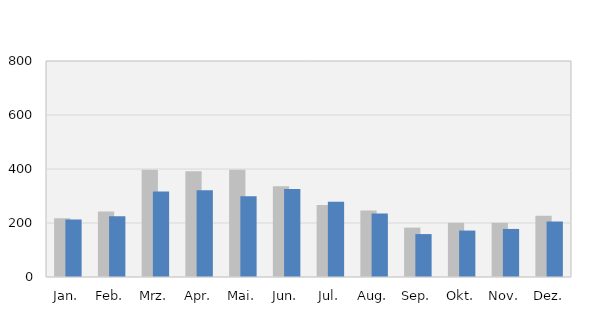
| Category | 2017 | 2018 |
|---|---|---|
| Jan. | 218 | 213 |
| Feb. | 243 | 225 |
| Mrz. | 397 | 317 |
| Apr. | 392 | 321 |
| Mai. | 397 | 299 |
| Jun. | 336 | 326 |
| Jul. | 267 | 279 |
| Aug. | 246 | 235 |
| Sep. | 183 | 159 |
| Okt. | 201 | 172 |
| Nov. | 201 | 178 |
| Dez. | 227 | 206 |